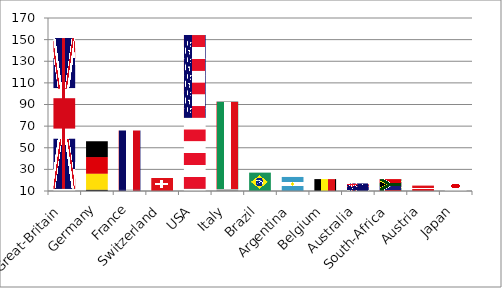
| Category | Series 0 |
|---|---|
| Great-Britain | 152 |
| Germany | 56 |
| France | 66 |
| Switzerland | 22 |
| USA | 155 |
| Italy | 93 |
| Brazil | 27 |
| Argentina | 23 |
| Belgium | 21 |
| Australia | 17 |
| South-Africa | 21 |
| Austria | 15 |
| Japan | 18 |